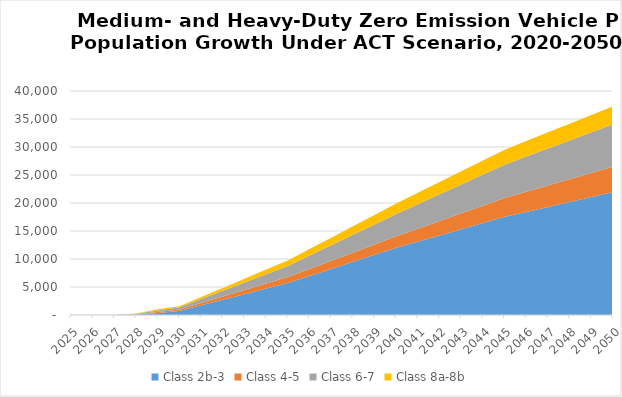
| Category | Class 2b-3 | Class 4-5 | Class 6-7 | Class 8a-8b |
|---|---|---|---|---|
| 2025.0 | 0 | 0 | 0 | 0 |
| 2026.0 | 0 | 0 | 0 | 0 |
| 2027.0 | 0 | 5.602 | 9.36 | 5.506 |
| 2028.0 | 85.263 | 52.418 | 94.156 | 54.953 |
| 2029.0 | 375.054 | 158.15 | 287.875 | 218.494 |
| 2030.0 | 730 | 230 | 420 | 180 |
| 2031.0 | 1728 | 394 | 734 | 340 |
| 2032.0 | 2726 | 558 | 1048 | 500 |
| 2033.0 | 3724 | 722 | 1362 | 660 |
| 2034.0 | 4722 | 886 | 1676 | 820 |
| 2035.0 | 5720 | 1050 | 1990 | 980 |
| 2036.0 | 6976 | 1250 | 2388 | 1160 |
| 2037.0 | 8232 | 1450 | 2786 | 1340 |
| 2038.0 | 9488 | 1650 | 3184 | 1520 |
| 2039.0 | 10744 | 1850 | 3582 | 1700 |
| 2040.0 | 12000 | 2050 | 3980 | 1880 |
| 2041.0 | 13106 | 2310 | 4378 | 2034 |
| 2042.0 | 14212 | 2570 | 4776 | 2188 |
| 2043.0 | 15318 | 2830 | 5174 | 2342 |
| 2044.0 | 16424 | 3090 | 5572 | 2496 |
| 2045.0 | 17530 | 3350 | 5970 | 2650 |
| 2046.0 | 18414 | 3588 | 6290 | 2764 |
| 2047.0 | 19298 | 3826 | 6610 | 2878 |
| 2048.0 | 20182 | 4064 | 6930 | 2992 |
| 2049.0 | 21066 | 4302 | 7250 | 3106 |
| 2050.0 | 21950 | 4540 | 7570 | 3220 |